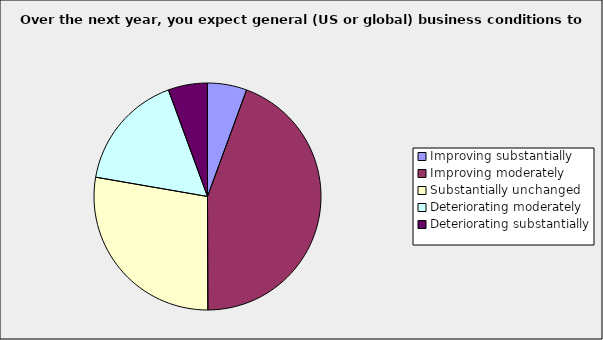
| Category | Series 0 |
|---|---|
| Improving substantially | 0.056 |
| Improving moderately | 0.444 |
| Substantially unchanged | 0.278 |
| Deteriorating moderately | 0.167 |
| Deteriorating substantially | 0.056 |